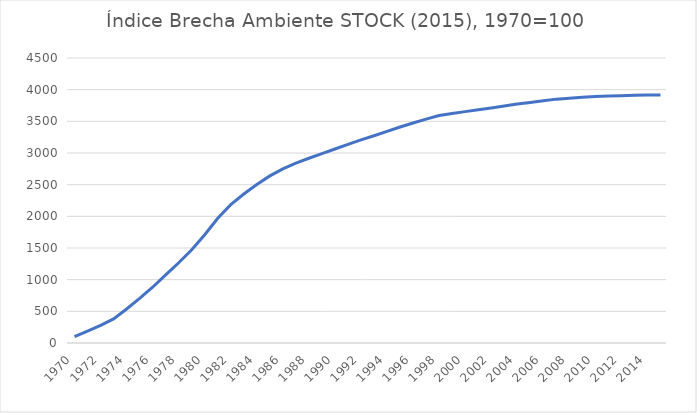
| Category | Índice Brecha Ambiente STOCK  (2015), 1970=100 |
|---|---|
| 1970.0 | 100 |
| 1971.0 | 187.348 |
| 1972.0 | 279.064 |
| 1973.0 | 380.74 |
| 1974.0 | 537.186 |
| 1975.0 | 703.474 |
| 1976.0 | 880.838 |
| 1977.0 | 1075.898 |
| 1978.0 | 1267.11 |
| 1979.0 | 1473.157 |
| 1980.0 | 1708.659 |
| 1981.0 | 1968.833 |
| 1982.0 | 2184.077 |
| 1983.0 | 2351.727 |
| 1984.0 | 2501.257 |
| 1985.0 | 2638.337 |
| 1986.0 | 2748.944 |
| 1987.0 | 2839.893 |
| 1988.0 | 2916.7 |
| 1989.0 | 2990.399 |
| 1990.0 | 3063.229 |
| 1991.0 | 3136.285 |
| 1992.0 | 3206.224 |
| 1993.0 | 3271.935 |
| 1994.0 | 3342.561 |
| 1995.0 | 3410.561 |
| 1996.0 | 3473.273 |
| 1997.0 | 3535.675 |
| 1998.0 | 3590.804 |
| 1999.0 | 3625.123 |
| 2000.0 | 3653.419 |
| 2001.0 | 3681.222 |
| 2002.0 | 3710.731 |
| 2003.0 | 3741.389 |
| 2004.0 | 3772.023 |
| 2005.0 | 3797.06 |
| 2006.0 | 3825.159 |
| 2007.0 | 3850.501 |
| 2008.0 | 3863.936 |
| 2009.0 | 3881.346 |
| 2010.0 | 3891.523 |
| 2011.0 | 3900.158 |
| 2012.0 | 3905.647 |
| 2013.0 | 3911.329 |
| 2014.0 | 3914.155 |
| 2015.0 | 3917.299 |